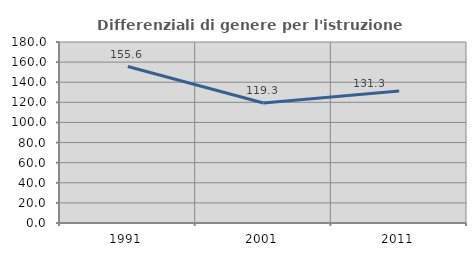
| Category | Differenziali di genere per l'istruzione superiore |
|---|---|
| 1991.0 | 155.602 |
| 2001.0 | 119.318 |
| 2011.0 | 131.286 |